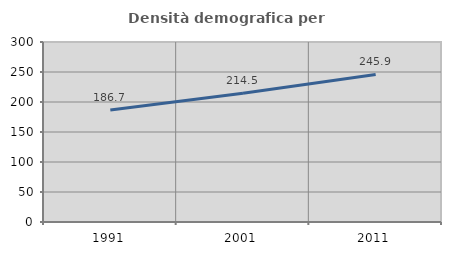
| Category | Densità demografica |
|---|---|
| 1991.0 | 186.655 |
| 2001.0 | 214.45 |
| 2011.0 | 245.861 |